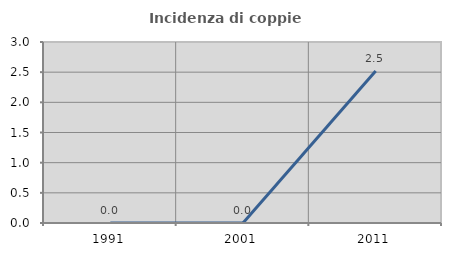
| Category | Incidenza di coppie miste |
|---|---|
| 1991.0 | 0 |
| 2001.0 | 0 |
| 2011.0 | 2.521 |